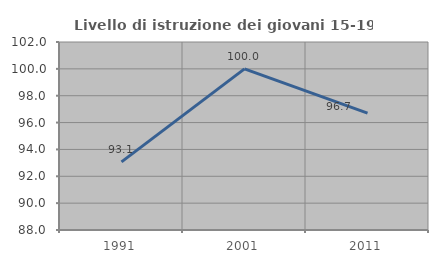
| Category | Livello di istruzione dei giovani 15-19 anni |
|---|---|
| 1991.0 | 93.069 |
| 2001.0 | 100 |
| 2011.0 | 96.703 |